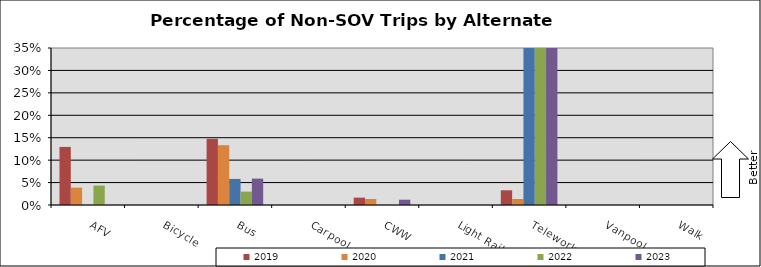
| Category | 2019 | 2020 | 2021 | 2022 | 2023 |
|---|---|---|---|---|---|
| AFV | 0.13 | 0.039 | 0 | 0.043 | 0 |
| Bicycle | 0 | 0 | 0 | 0 | 0 |
| Bus | 0.148 | 0.133 | 0.058 | 0.03 | 0.059 |
| Carpool | 0 | 0 | 0 | 0 | 0 |
| CWW | 0.016 | 0.013 | 0 | 0 | 0.012 |
| Light Rail | 0 | 0 | 0 | 0 | 0 |
| Telework | 0.033 | 0.013 | 0.593 | 0.672 | 0.553 |
| Vanpool | 0 | 0 | 0 | 0 | 0 |
| Walk | 0 | 0 | 0 | 0 | 0 |